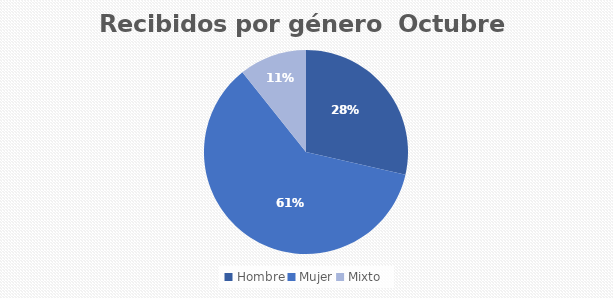
| Category | Recibidos por género  OCTUBRE |
|---|---|
| Hombre | 8 |
| Mujer | 17 |
| Mixto | 3 |